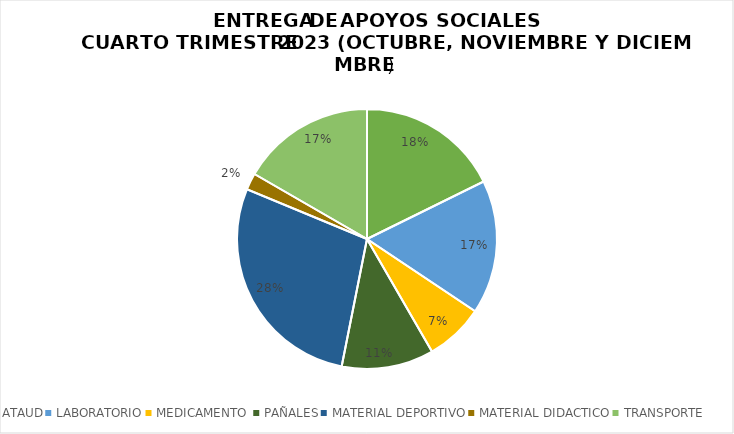
| Category | OCTUBRE  | NOVIEMBRE  | DICIEMBRE  | TOTALES | Series 4 |
|---|---|---|---|---|---|
| ATAUD | 17 | 6 | 4 | 17 |  |
| LABORATORIO | 16 | 10 | 2 | 16 |  |
| MEDICAMENTO  | 7 | 1 | 2 | 7 |  |
| PAÑALES | 11 | 3 | 1 | 11 |  |
| MATERIAL DEPORTIVO | 27 | 10 | 5 | 27 |  |
| MATERIAL DIDACTICO | 2 | 2 | 0 | 2 |  |
| TRANSPORTE | 16 | 7 | 4 | 16 |  |